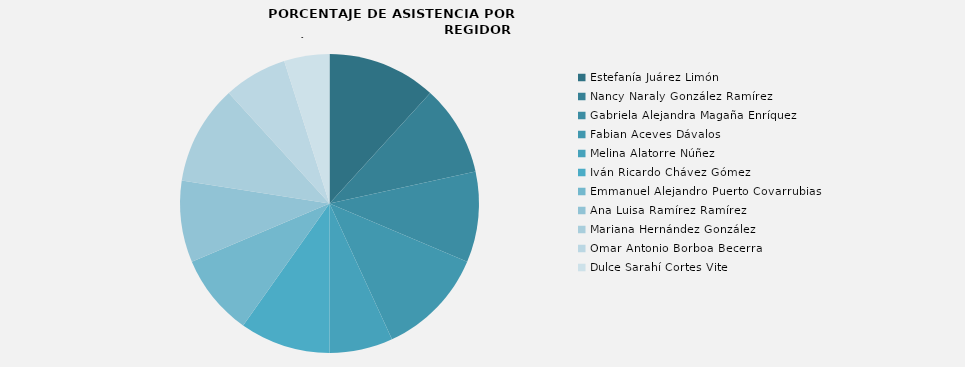
| Category | Estefanía Juárez Limón  |
|---|---|
| Estefanía Juárez Limón  | 100 |
| Nancy Naraly González Ramírez | 83.333 |
| Gabriela Alejandra Magaña Enríquez | 83.333 |
| Fabian Aceves Dávalos | 100 |
| Melina Alatorre Núñez | 58.333 |
| Iván Ricardo Chávez Gómez | 83.333 |
| Emmanuel Alejandro Puerto Covarrubias | 75 |
| Ana Luisa Ramírez Ramírez | 75 |
| Mariana Hernández González | 91.667 |
| Omar Antonio Borboa Becerra | 58.333 |
| Dulce Sarahí Cortes Vite | 41.667 |